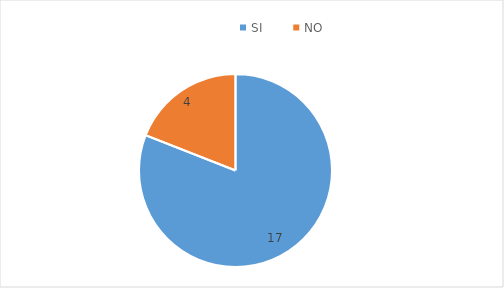
| Category | Series 0 |
|---|---|
| SI | 17 |
| NO | 4 |